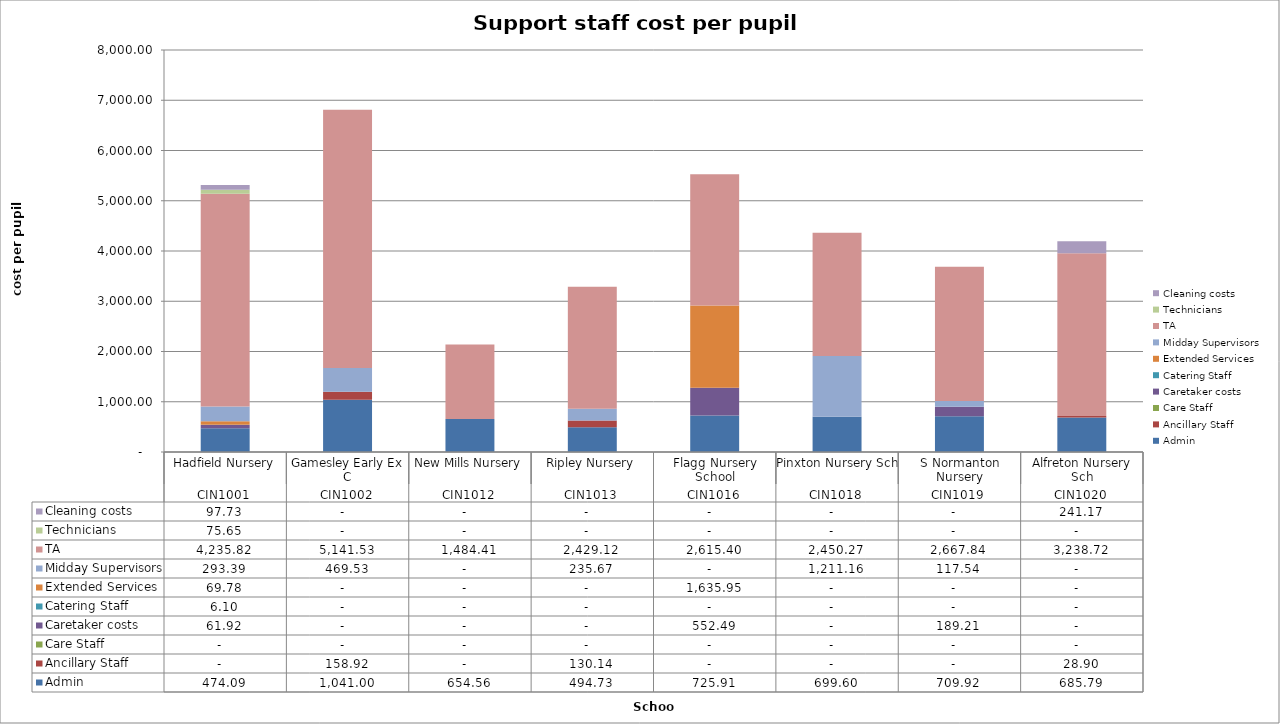
| Category | Admin | Ancillary Staff | Care Staff | Caretaker costs | Catering Staff  | Extended Services | Midday Supervisors | TA | Technicians | Cleaning costs |
|---|---|---|---|---|---|---|---|---|---|---|
| 0 | 474.093 | 0 | 0 | 61.915 | 6.101 | 69.781 | 293.39 | 4235.815 | 75.652 | 97.726 |
| 1 | 1041.001 | 158.917 | 0 | 0 | 0 | 0 | 469.53 | 5141.529 | 0 | 0 |
| 2 | 654.557 | 0 | 0 | 0 | 0 | 0 | 0 | 1484.411 | 0 | 0 |
| 3 | 494.733 | 130.144 | 0 | 0 | 0 | 0 | 235.667 | 2429.122 | 0 | 0 |
| 4 | 725.908 | 0 | 0 | 552.488 | 0 | 1635.946 | 0 | 2615.404 | 0 | 0 |
| 5 | 699.604 | 0 | 0 | 0 | 0 | 0 | 1211.158 | 2450.265 | 0 | 0 |
| 6 | 709.925 | 0 | 0 | 189.205 | 0 | 0 | 117.545 | 2667.836 | 0 | 0 |
| 7 | 685.791 | 28.9 | 0 | 0 | 0 | 0 | 0 | 3238.722 | 0 | 241.166 |